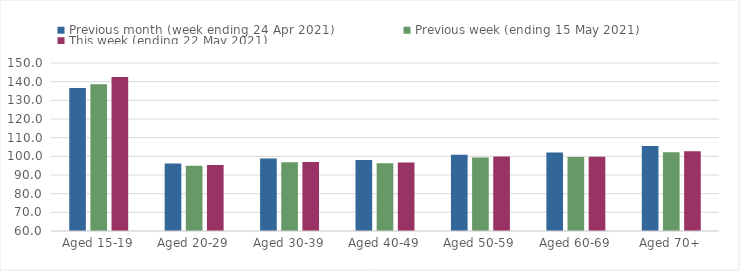
| Category | Previous month (week ending 24 Apr 2021) | Previous week (ending 15 May 2021) | This week (ending 22 May 2021) |
|---|---|---|---|
| Aged 15-19 | 136.61 | 138.64 | 142.53 |
| Aged 20-29 | 96.13 | 95.02 | 95.31 |
| Aged 30-39 | 98.8 | 96.84 | 96.95 |
| Aged 40-49 | 98.01 | 96.32 | 96.75 |
| Aged 50-59 | 100.9 | 99.42 | 99.96 |
| Aged 60-69 | 102.05 | 99.59 | 99.83 |
| Aged 70+ | 105.52 | 102.25 | 102.68 |